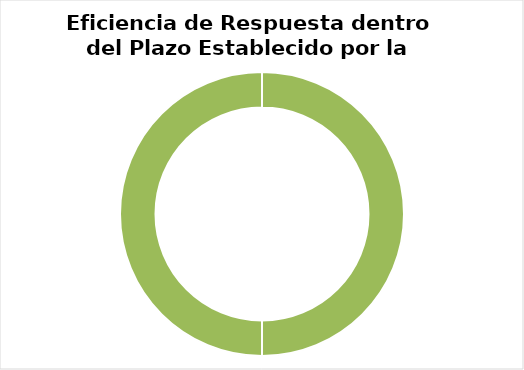
| Category | Series 0 |
|---|---|
| 0 | 50 |
| 1 | 0 |
| 2 | 50 |